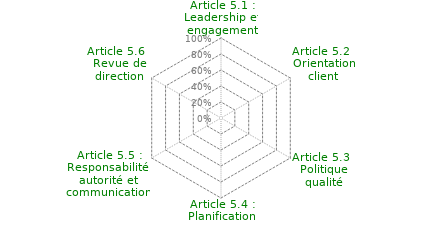
| Category | Article 5 : Gestion des responsabilités |
|---|---|
| Article 5.1 : Leadership et engagement | 0 |
| Article 5.2 : Orientation client | 0 |
| Article 5.3 : Politique qualité | 0 |
| Article 5.4 : Planification | 0 |
| Article 5.5 : Responsabilité, autorité et communication | 0 |
| Article 5.6 : Revue de direction | 0 |